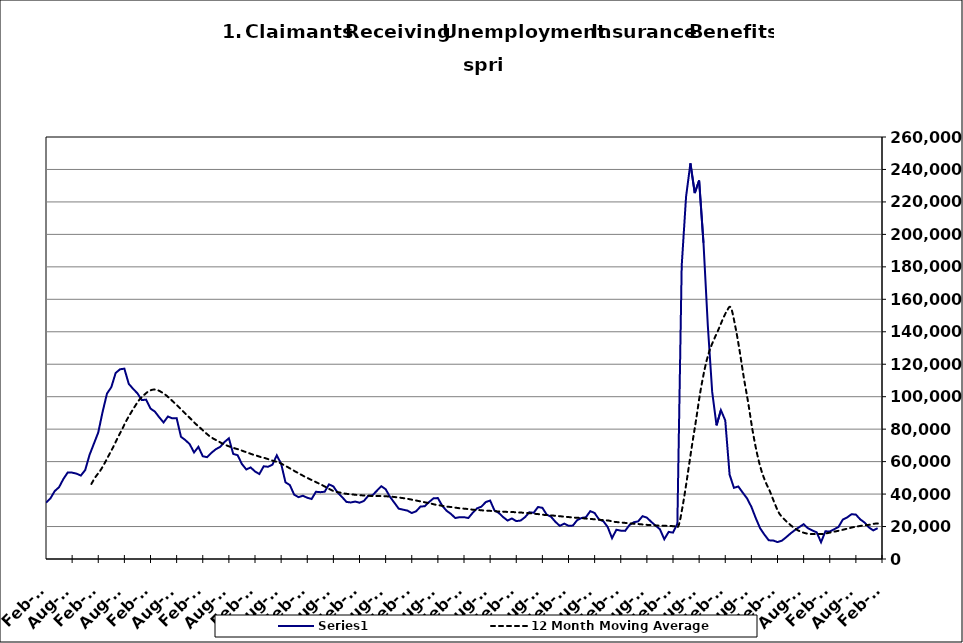
| Category | Series 0 |
|---|---|
| 2000-01-31 | 15239 |
| 2000-02-29 | 13995 |
| 2000-03-31 | 14536 |
| 2000-04-30 | 18337 |
| 2000-05-31 | 20863 |
| 2000-06-30 | 24310 |
| 2000-07-31 | 29359 |
| 2000-08-31 | 29764 |
| 2000-09-30 | 24540 |
| 2000-10-31 | 23067 |
| 2000-11-30 | 21129 |
| 2000-12-31 | 20288 |
| 2001-01-31 | 23646 |
| 2001-02-28 | 23782 |
| 2001-03-31 | 27047 |
| 2001-04-30 | 34048 |
| 2001-05-31 | 38168 |
| 2001-06-30 | 41894 |
| 2001-07-31 | 48114 |
| 2001-08-31 | 47646 |
| 2001-09-30 | 44132 |
| 2001-10-31 | 44465 |
| 2001-11-30 | 45928 |
| 2001-12-31 | 48930 |
| 2002-01-31 | 51864 |
| 2002-02-28 | 50778 |
| 2002-03-31 | 53014 |
| 2002-04-30 | 65394 |
| 2002-05-31 | 67925 |
| 2002-06-30 | 68727 |
| 2002-07-31 | 67269 |
| 2002-08-31 | 64233 |
| 2002-09-30 | 59955 |
| 2002-10-31 | 55535 |
| 2002-11-30 | 52233 |
| 2002-12-31 | 52252 |
| 2003-01-31 | 52694 |
| 2003-02-28 | 52578 |
| 2003-03-31 | 56236 |
| 2003-04-30 | 61020 |
| 2003-05-31 | 60584 |
| 2003-06-30 | 64980 |
| 2003-07-31 | 66426 |
| 2003-08-31 | 65403 |
| 2003-09-30 | 58348 |
| 2003-10-31 | 53953 |
| 2003-11-30 | 50453 |
| 2003-12-31 | 47799 |
| 2004-01-31 | 47134 |
| 2004-02-29 | 42441 |
| 2004-03-31 | 39363 |
| 2004-04-30 | 41157 |
| 2004-05-31 | 40892 |
| 2004-06-30 | 43601 |
| 2004-07-31 | 45411 |
| 2004-08-31 | 44738 |
| 2004-09-30 | 36049 |
| 2004-10-31 | 33551 |
| 2004-11-30 | 31386 |
| 2004-12-31 | 30195 |
| 2005-01-31 | 31661 |
| 2005-02-28 | 28205 |
| 2005-03-31 | 28194 |
| 2005-04-30 | 31233 |
| 2005-05-31 | 24184 |
| 2005-06-30 | 33525 |
| 2005-07-31 | 35776 |
| 2005-08-31 | 33297 |
| 2005-09-30 | 27423 |
| 2005-10-31 | 25647 |
| 2005-11-30 | 21039 |
| 2005-12-31 | 21238 |
| 2006-01-31 | 22270 |
| 2006-02-28 | 19689 |
| 2006-03-31 | 19474 |
| 2006-04-30 | 22420 |
| 2006-05-31 | 24146 |
| 2006-06-30 | 26450 |
| 2006-07-31 | 30575 |
| 2006-08-31 | 30038 |
| 2006-09-30 | 25657 |
| 2006-10-31 | 24869 |
| 2006-11-30 | 22832 |
| 2006-12-31 | 22826 |
| 2007-01-31 | 24459 |
| 2007-02-28 | 23856 |
| 2007-03-31 | 24786 |
| 2007-04-30 | 29690 |
| 2007-05-31 | 31303 |
| 2007-06-30 | 33512 |
| 2007-07-31 | 39176 |
| 2007-08-31 | 37077 |
| 2007-09-30 | 34179 |
| 2007-10-31 | 32130 |
| 2007-11-15 | 31205 |
| 2007-12-15 09:36:00 | 31973 |
| 2008-01-14 19:12:00 | 33494 |
| 2008-02-14 04:48:00 | 34694 |
| 2008-03-15 14:24:00 | 37279 |
| 2008-04-15 | 41840 |
| 2008-05-15 09:36:00 | 44245 |
| 2008-06-14 19:12:00 | 49341 |
| 2008-07-15 04:48:00 | 53353 |
| 2008-08-14 14:24:00 | 53222 |
| 2008-09-14 | 52594 |
| 2008-10-14 09:36:00 | 51417 |
| 2008-11-13 19:12:00 | 54795 |
| 2008-12-14 04:48:00 | 64139 |
| 2009-01-13 14:24:00 | 71026 |
| 2009-02-13 | 77947 |
| 2009-03-15 09:36:00 | 90649 |
| 2009-04-14 19:12:00 | 101865 |
| 2009-05-15 04:48:00 | 105867 |
| 2009-06-14 14:24:00 | 114626 |
| 2009-07-15 | 116882 |
| 2009-08-14 09:36:00 | 117270 |
| 2009-09-13 19:12:00 | 107943 |
| 2009-10-14 04:48:00 | 104849 |
| 2009-11-13 14:24:00 | 102065 |
| 2009-12-14 | 97917 |
| 2010-01-13 09:36:00 | 98175 |
| 2010-02-12 19:12:00 | 92691 |
| 2010-03-15 04:48:00 | 90832 |
| 2010-04-14 14:24:00 | 87347 |
| 2010-05-15 | 84120 |
| 2010-06-14 09:36:00 | 87787 |
| 2010-07-14 19:12:00 | 86654 |
| 2010-08-14 04:48:00 | 86789 |
| 2010-09-13 14:24:00 | 75317 |
| 2010-10-14 | 73259 |
| 2010-11-13 09:36:00 | 70783 |
| 2010-12-13 19:12:00 | 65644 |
| 2011-01-13 04:48:00 | 69106 |
| 2011-02-12 14:24:00 | 63322 |
| 2011-03-15 | 62724 |
| 2011-04-14 09:36:00 | 65434 |
| 2011-05-14 19:12:00 | 67641 |
| 2011-06-14 04:48:00 | 69087 |
| 2011-07-14 14:24:00 | 72082 |
| 2011-08-14 | 74376 |
| 2011-09-13 09:36:00 | 64739 |
| 2011-10-13 19:12:00 | 63965 |
| 2011-11-13 04:48:00 | 58496 |
| 2011-12-13 14:24:00 | 55173 |
| 2012-01-13 | 56418 |
| 2012-02-12 09:36:00 | 53942 |
| 2012-03-13 19:12:00 | 52352 |
| 2012-04-13 04:48:00 | 57118 |
| 2012-05-13 14:24:00 | 56827 |
| 2012-06-13 | 58115 |
| 2012-07-13 09:36:00 | 63863 |
| 2012-08-12 19:12:00 | 58706 |
| 2012-09-12 04:48:00 | 47243 |
| 2012-10-12 14:24:00 | 45567 |
| 2012-11-12 | 39623 |
| 2012-12-12 09:36:00 | 38101 |
| 2013-01-11 19:12:00 | 38966 |
| 2013-02-11 04:48:00 | 37746 |
| 2013-03-13 14:24:00 | 36956 |
| 2013-04-13 | 41439 |
| 2013-05-13 09:36:00 | 41162 |
| 2013-06-12 19:12:00 | 41455 |
| 2013-07-13 04:48:00 | 45989 |
| 2013-08-12 14:24:00 | 44712 |
| 2013-09-12 | 40828 |
| 2013-10-12 09:36:00 | 38185 |
| 2013-11-11 19:12:00 | 35184 |
| 2013-12-12 04:48:00 | 34824 |
| 2014-01-11 14:24:00 | 35396 |
| 2014-02-11 | 34683 |
| 2014-03-13 09:36:00 | 35748 |
| 2014-04-12 19:12:00 | 38892 |
| 2014-05-13 04:48:00 | 39325 |
| 2014-06-12 14:24:00 | 42091 |
| 2014-07-13 | 44842 |
| 2014-08-14 | 43016 |
| 2014-09-13 09:36:00 | 38304 |
| 2014-10-13 19:12:00 | 34708 |
| 2014-11-13 04:48:00 | 31017 |
| 2014-12-13 14:24:00 | 30402 |
| 2015-01-13 | 29823 |
| 2015-02-12 09:36:00 | 28333 |
| 2015-03-14 19:12:00 | 29389 |
| 2015-04-14 04:48:00 | 32293 |
| 2015-05-14 14:24:00 | 32538 |
| 2015-06-14 | 35137 |
| 2015-07-14 09:36:00 | 37398 |
| 2015-08-13 19:12:00 | 37536 |
| 2015-09-13 04:48:00 | 32808 |
| 2015-10-13 14:24:00 | 29728 |
| 2015-11-13 | 27775 |
| 2015-12-13 09:36:00 | 25227 |
| 2016-01-12 19:12:00 | 25773 |
| 2016-02-12 04:48:00 | 25758 |
| 2016-03-13 14:24:00 | 25247 |
| 2016-04-13 | 28463 |
| 2016-05-13 09:36:00 | 31210 |
| 2016-06-12 19:12:00 | 32255 |
| 2016-07-13 04:48:00 | 35088 |
| 2016-08-12 14:24:00 | 36018 |
| 2016-09-12 | 29922 |
| 2016-10-12 09:36:00 | 28368 |
| 2016-11-11 19:12:00 | 25818 |
| 2016-12-12 04:48:00 | 23690 |
| 2017-01-11 14:24:00 | 24964 |
| 2017-02-11 | 23348 |
| 2017-03-13 09:36:00 | 23685 |
| 2017-04-12 19:12:00 | 25733 |
| 2017-05-13 04:48:00 | 28796 |
| 2017-06-12 14:24:00 | 28489 |
| 2017-07-13 | 32034 |
| 2017-08-12 09:36:00 | 31539 |
| 2017-09-11 19:12:00 | 27321 |
| 2017-10-12 04:48:00 | 25990 |
| 2017-11-11 14:24:00 | 22875 |
| 2017-12-12 | 20445 |
| 2018-01-11 09:36:00 | 21794 |
| 2018-02-10 19:12:00 | 20475 |
| 2018-03-13 04:48:00 | 20585 |
| 2018-04-12 14:24:00 | 23969 |
| 2018-05-13 | 25280 |
| 2018-06-12 09:36:00 | 25741 |
| 2018-07-12 19:12:00 | 29479 |
| 2018-08-12 04:48:00 | 28351 |
| 2018-09-11 14:24:00 | 24386 |
| 2018-10-12 | 23292 |
| 2018-11-11 09:36:00 | 19711 |
| 2018-12-11 19:12:00 | 12853 |
| 2019-01-11 04:48:00 | 18039 |
| 2019-02-10 14:24:00 | 17466 |
| 2019-03-13 | 17325 |
| 2019-04-12 09:36:00 | 20890 |
| 2019-05-12 19:12:00 | 22641 |
| 2019-06-12 04:48:00 | 23178 |
| 2019-07-12 14:24:00 | 26385 |
| 2019-08-12 | 25501 |
| 2019-09-11 09:36:00 | 22892 |
| 2019-10-11 19:12:00 | 20585 |
| 2019-11-11 04:48:00 | 18323 |
| 2019-12-11 14:24:00 | 12174 |
| 2020-01-11 | 16684 |
| 2020-02-10 09:36:00 | 16260 |
| 2020-03-11 19:12:00 | 21667 |
| 2020-04-11 04:48:00 | 180666 |
| 2020-05-11 14:24:00 | 223189 |
| 2020-06-11 | 243809 |
| 2020-07-11 09:36:00 | 225469 |
| 2020-08-10 19:12:00 | 233220 |
| 2020-09-10 04:48:00 | 194839 |
| 2020-10-10 14:24:00 | 143722 |
| 2020-11-10 | 102967 |
| 2020-12-10 09:36:00 | 82367 |
| 2021-01-09 19:12:00 | 91710 |
| 2021-02-09 04:48:00 | 85397 |
| 2021-03-11 14:24:00 | 51963 |
| 2021-04-11 | 43840 |
| 2021-05-11 09:36:00 | 44687 |
| 2021-06-10 19:12:00 | 40936 |
| 2021-07-11 04:48:00 | 37365 |
| 2021-08-10 14:24:00 | 32159 |
| 2021-09-10 | 25254 |
| 2021-10-10 09:36:00 | 18966 |
| 2021-11-09 19:12:00 | 14997 |
| 2021-12-10 04:48:00 | 11499 |
| 2022-01-09 14:24:00 | 11404 |
| 2022-02-09 | 10424 |
| 2022-03-11 09:36:00 | 11269 |
| 2022-04-10 19:12:00 | 13419 |
| 2022-05-11 04:48:00 | 15755 |
| 2022-06-10 14:24:00 | 17823 |
| 2022-07-11 | 19654 |
| 2022-08-10 09:36:00 | 21418 |
| 2022-09-09 19:12:00 | 18932 |
| 2022-10-10 04:48:00 | 17577 |
| 2022-11-09 14:24:00 | 16421 |
| 2022-12-10 | 10320 |
| 2023-01-09 09:36:00 | 17072 |
| 2023-02-08 19:12:00 | 16921 |
| 2023-03-11 04:48:00 | 18314 |
| 2023-04-10 14:24:00 | 19704 |
| 2023-05-11 | 24285 |
| 2023-06-10 09:36:00 | 25600 |
| 2023-07-10 19:12:00 | 27593 |
| 2023-08-10 04:48:00 | 27363 |
| 2023-09-09 14:24:00 | 24414 |
| 2023-10-10 | 22474 |
| 2023-11-09 09:36:00 | 19433 |
| 2023-12-09 19:12:00 | 17628 |
| 2024-01-09 04:48:00 | 19001 |
| 2024-02-08 14:24:00 | 17923 |